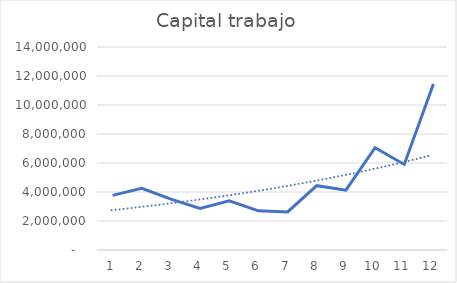
| Category | Series 0 |
|---|---|
| 0 | 3769425.755 |
| 1 | 4256826.555 |
| 2 | 3502992.165 |
| 3 | 2866827.648 |
| 4 | 3393327.038 |
| 5 | 2699182.243 |
| 6 | 2625460.607 |
| 7 | 4437145.462 |
| 8 | 4127648.528 |
| 9 | 7050821.56 |
| 10 | 5900981.779 |
| 11 | 11454701.575 |